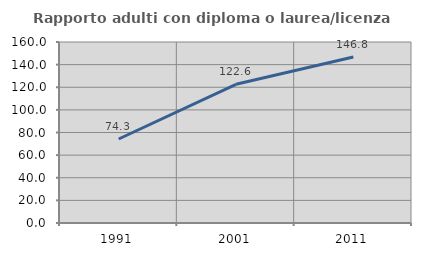
| Category | Rapporto adulti con diploma o laurea/licenza media  |
|---|---|
| 1991.0 | 74.259 |
| 2001.0 | 122.577 |
| 2011.0 | 146.78 |